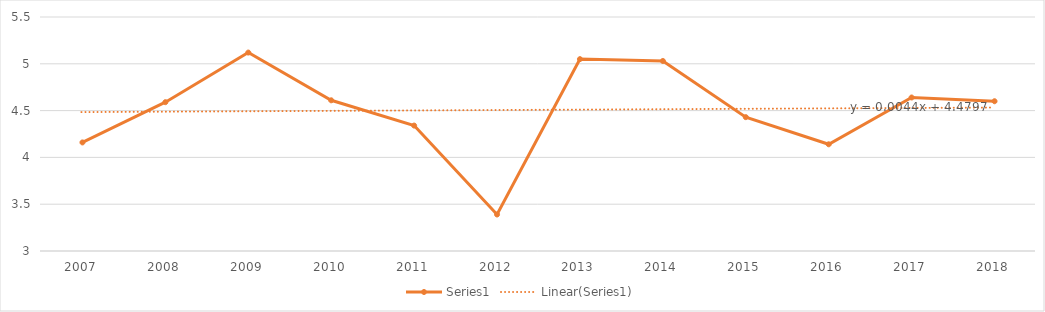
| Category | Series 1 |
|---|---|
| 2007.0 | 4.16 |
| 2008.0 | 4.59 |
| 2009.0 | 5.12 |
| 2010.0 | 4.61 |
| 2011.0 | 4.34 |
| 2012.0 | 3.39 |
| 2013.0 | 5.05 |
| 2014.0 | 5.03 |
| 2015.0 | 4.43 |
| 2016.0 | 4.14 |
| 2017.0 | 4.64 |
| 2018.0 | 4.6 |